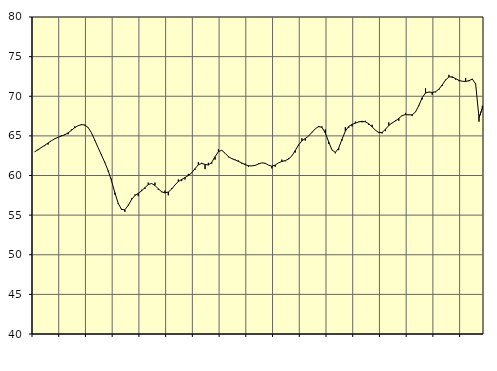
| Category | Piggar | Samtliga anställda (inkl. anställda utomlands) |
|---|---|---|
| nan | 63 | 62.98 |
| 87.0 | 63.2 | 63.26 |
| 87.0 | 63.6 | 63.53 |
| 87.0 | 63.7 | 63.81 |
| nan | 63.9 | 64.1 |
| 88.0 | 64.4 | 64.38 |
| 88.0 | 64.6 | 64.63 |
| 88.0 | 64.8 | 64.82 |
| nan | 65.1 | 64.98 |
| 89.0 | 65.2 | 65.13 |
| 89.0 | 65.2 | 65.38 |
| 89.0 | 65.8 | 65.7 |
| nan | 66.2 | 66.04 |
| 90.0 | 66.3 | 66.29 |
| 90.0 | 66.5 | 66.41 |
| 90.0 | 66.3 | 66.38 |
| nan | 66.1 | 66.06 |
| 91.0 | 65.4 | 65.39 |
| 91.0 | 64.4 | 64.46 |
| 91.0 | 63.5 | 63.5 |
| nan | 62.7 | 62.58 |
| 92.0 | 61.7 | 61.64 |
| 92.0 | 60.5 | 60.61 |
| 92.0 | 59.6 | 59.32 |
| nan | 57.6 | 57.84 |
| 93.0 | 56.4 | 56.49 |
| 93.0 | 55.8 | 55.71 |
| 93.0 | 55.4 | 55.68 |
| nan | 56.3 | 56.23 |
| 94.0 | 57.1 | 56.96 |
| 94.0 | 57.6 | 57.48 |
| 94.0 | 57.4 | 57.75 |
| nan | 58.2 | 58.06 |
| 95.0 | 58.3 | 58.47 |
| 95.0 | 59.1 | 58.86 |
| 95.0 | 59 | 58.99 |
| nan | 59.1 | 58.75 |
| 96.0 | 58.2 | 58.32 |
| 96.0 | 57.9 | 57.95 |
| 96.0 | 58.1 | 57.8 |
| nan | 57.5 | 57.92 |
| 97.0 | 58.4 | 58.29 |
| 97.0 | 58.8 | 58.81 |
| 97.0 | 59.5 | 59.23 |
| nan | 59.3 | 59.5 |
| 98.0 | 59.5 | 59.74 |
| 98.0 | 60.2 | 60 |
| 98.0 | 60.3 | 60.34 |
| nan | 60.7 | 60.86 |
| 99.0 | 61.7 | 61.36 |
| 99.0 | 61.6 | 61.52 |
| 99.0 | 60.8 | 61.4 |
| nan | 61.6 | 61.32 |
| 0.0 | 61.5 | 61.66 |
| 0.0 | 62 | 62.37 |
| 0.0 | 63.3 | 63.02 |
| nan | 63.2 | 63.18 |
| 1.0 | 62.8 | 62.81 |
| 1.0 | 62.3 | 62.38 |
| 1.0 | 62.2 | 62.13 |
| nan | 62 | 61.96 |
| 2.0 | 61.9 | 61.78 |
| 2.0 | 61.5 | 61.58 |
| 2.0 | 61.5 | 61.37 |
| nan | 61.1 | 61.23 |
| 3.0 | 61.2 | 61.21 |
| 3.0 | 61.3 | 61.28 |
| 3.0 | 61.5 | 61.45 |
| nan | 61.6 | 61.6 |
| 4.0 | 61.5 | 61.54 |
| 4.0 | 61.3 | 61.31 |
| 4.0 | 60.9 | 61.17 |
| nan | 61.1 | 61.32 |
| 5.0 | 61.6 | 61.59 |
| 5.0 | 62 | 61.77 |
| 5.0 | 61.8 | 61.88 |
| nan | 62.2 | 62.08 |
| 6.0 | 62.5 | 62.48 |
| 6.0 | 62.9 | 63.15 |
| 6.0 | 63.8 | 63.87 |
| nan | 64.7 | 64.38 |
| 7.0 | 64.4 | 64.67 |
| 7.0 | 65 | 64.98 |
| 7.0 | 65.5 | 65.44 |
| nan | 65.9 | 65.89 |
| 8.0 | 66.1 | 66.19 |
| 8.0 | 66.2 | 66.07 |
| 8.0 | 65.8 | 65.36 |
| nan | 64 | 64.25 |
| 9.0 | 63.2 | 63.22 |
| 9.0 | 62.8 | 62.91 |
| 9.0 | 63.2 | 63.46 |
| nan | 64.4 | 64.58 |
| 10.0 | 66.1 | 65.6 |
| 10.0 | 66 | 66.19 |
| 10.0 | 66.2 | 66.45 |
| nan | 66.8 | 66.6 |
| 11.0 | 66.8 | 66.76 |
| 11.0 | 66.7 | 66.84 |
| 11.0 | 66.9 | 66.77 |
| nan | 66.4 | 66.53 |
| 12.0 | 66.4 | 66.13 |
| 12.0 | 65.7 | 65.72 |
| 12.0 | 65.5 | 65.41 |
| nan | 65.3 | 65.43 |
| 13.0 | 65.6 | 65.83 |
| 13.0 | 66.7 | 66.31 |
| 13.0 | 66.6 | 66.64 |
| nan | 67 | 66.88 |
| 14.0 | 66.9 | 67.21 |
| 14.0 | 67.5 | 67.56 |
| 14.0 | 67.9 | 67.69 |
| nan | 67.7 | 67.65 |
| 15.0 | 67.5 | 67.66 |
| 15.0 | 68 | 68.02 |
| 15.0 | 68.9 | 68.83 |
| nan | 69.6 | 69.82 |
| 16.0 | 71 | 70.42 |
| 16.0 | 70.5 | 70.54 |
| 16.0 | 70.2 | 70.48 |
| nan | 70.5 | 70.57 |
| 17.0 | 70.8 | 70.89 |
| 17.0 | 71.3 | 71.43 |
| 17.0 | 72.1 | 72.05 |
| nan | 72.7 | 72.44 |
| 18.0 | 72.3 | 72.45 |
| 18.0 | 72.1 | 72.22 |
| 18.0 | 71.9 | 72.01 |
| nan | 71.9 | 71.89 |
| 19.0 | 72.3 | 71.87 |
| 19.0 | 71.9 | 71.96 |
| 19.0 | 72.2 | 72.17 |
| nan | 71.6 | 71.55 |
| 20.0 | 66.8 | 67.29 |
| 20.0 | 68.8 | 68.49 |